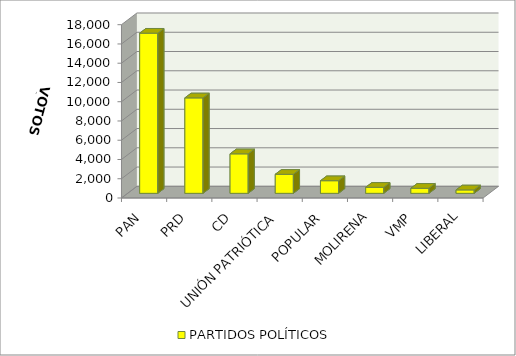
| Category | PARTIDOS POLÍTICOS |
|---|---|
| PAN | 16636 |
| PRD | 9914 |
| CD | 4102 |
| UNIÓN PATRIÓTICA | 1978 |
| POPULAR | 1311 |
| MOLIRENA | 628 |
| VMP | 528 |
| LIBERAL | 356 |